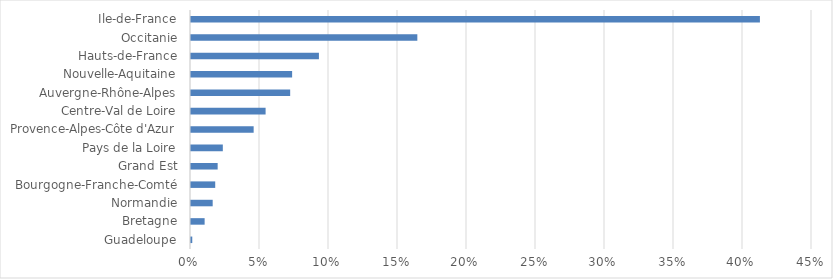
| Category | Series 0 |
|---|---|
| Guadeloupe | 0.001 |
| Bretagne | 0.01 |
| Normandie | 0.016 |
| Bourgogne-Franche-Comté | 0.018 |
| Grand Est | 0.019 |
| Pays de la Loire | 0.023 |
| Provence-Alpes-Côte d'Azur | 0.045 |
| Centre-Val de Loire | 0.054 |
| Auvergne-Rhône-Alpes | 0.072 |
| Nouvelle-Aquitaine | 0.073 |
| Hauts-de-France | 0.093 |
| Occitanie | 0.164 |
| Ile-de-France | 0.412 |